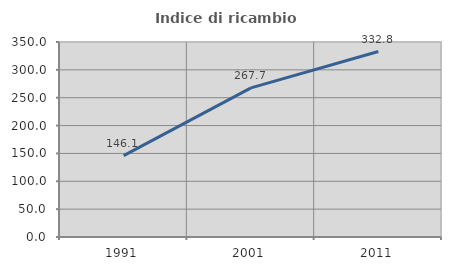
| Category | Indice di ricambio occupazionale  |
|---|---|
| 1991.0 | 146.067 |
| 2001.0 | 267.727 |
| 2011.0 | 332.836 |